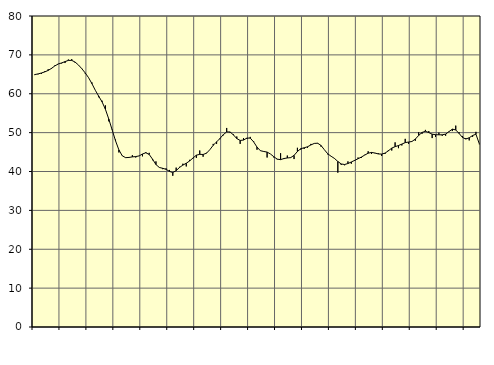
| Category | Piggar | Series 1 |
|---|---|---|
| nan | 64.8 | 64.93 |
| 87.0 | 65 | 65.1 |
| 87.0 | 65.1 | 65.34 |
| 87.0 | 65.8 | 65.62 |
| nan | 66.3 | 66 |
| 88.0 | 66.4 | 66.53 |
| 88.0 | 67.3 | 67.17 |
| 88.0 | 67.7 | 67.65 |
| nan | 67.8 | 67.93 |
| 89.0 | 67.9 | 68.26 |
| 89.0 | 68.8 | 68.58 |
| 89.0 | 68.9 | 68.58 |
| nan | 68 | 68.15 |
| 90.0 | 67.4 | 67.39 |
| 90.0 | 66.5 | 66.44 |
| 90.0 | 65.2 | 65.36 |
| nan | 64.1 | 64.13 |
| 91.0 | 62.9 | 62.59 |
| 91.0 | 60.9 | 60.89 |
| 91.0 | 59.1 | 59.38 |
| nan | 58.2 | 57.92 |
| 92.0 | 57 | 56 |
| 92.0 | 52.9 | 53.49 |
| 92.0 | 50.8 | 50.7 |
| nan | 48.2 | 47.9 |
| 93.0 | 44.9 | 45.55 |
| 93.0 | 44.1 | 44.04 |
| 93.0 | 43.5 | 43.56 |
| nan | 43.6 | 43.62 |
| 94.0 | 44.2 | 43.76 |
| 94.0 | 43.6 | 43.84 |
| 94.0 | 44 | 44.01 |
| nan | 43.9 | 44.5 |
| 95.0 | 45 | 44.82 |
| 95.0 | 44.8 | 44.38 |
| 95.0 | 42.9 | 43.15 |
| nan | 42.6 | 41.79 |
| 96.0 | 41 | 41.04 |
| 96.0 | 40.6 | 40.82 |
| 96.0 | 40.8 | 40.56 |
| nan | 40.4 | 40.03 |
| 97.0 | 38.9 | 39.73 |
| 97.0 | 41 | 40.22 |
| 97.0 | 41.2 | 41.04 |
| nan | 42 | 41.65 |
| 98.0 | 41.3 | 42.12 |
| 98.0 | 43 | 42.71 |
| 98.0 | 43.4 | 43.48 |
| nan | 43.5 | 44.2 |
| 99.0 | 45.4 | 44.41 |
| 99.0 | 43.8 | 44.38 |
| 99.0 | 44.8 | 44.7 |
| nan | 45.6 | 45.61 |
| 0.0 | 47.1 | 46.75 |
| 0.0 | 47.1 | 47.61 |
| 0.0 | 48.3 | 48.49 |
| nan | 49.3 | 49.49 |
| 1.0 | 51.2 | 50.17 |
| 1.0 | 50 | 50.17 |
| 1.0 | 49.6 | 49.42 |
| nan | 49 | 48.47 |
| 2.0 | 47.1 | 47.99 |
| 2.0 | 48.6 | 48.09 |
| 2.0 | 48.4 | 48.6 |
| nan | 48.9 | 48.59 |
| 3.0 | 47.8 | 47.62 |
| 3.0 | 45.6 | 46.28 |
| 3.0 | 45.4 | 45.35 |
| nan | 45.1 | 45.15 |
| 4.0 | 43.6 | 45 |
| 4.0 | 44.5 | 44.5 |
| 4.0 | 43.6 | 43.8 |
| nan | 43.1 | 43.18 |
| 5.0 | 44.7 | 43.05 |
| 5.0 | 43.2 | 43.34 |
| 5.0 | 44.1 | 43.48 |
| nan | 43.5 | 43.57 |
| 6.0 | 43.2 | 44.15 |
| 6.0 | 46.1 | 45.14 |
| 6.0 | 45.6 | 45.87 |
| nan | 45.8 | 46.1 |
| 7.0 | 46.1 | 46.36 |
| 7.0 | 47.1 | 46.83 |
| 7.0 | 47.2 | 47.22 |
| nan | 47.2 | 47.28 |
| 8.0 | 46.4 | 46.7 |
| 8.0 | 45.6 | 45.6 |
| 8.0 | 44.4 | 44.55 |
| nan | 43.9 | 43.92 |
| 9.0 | 43.3 | 43.36 |
| 9.0 | 39.7 | 42.58 |
| 9.0 | 41.7 | 41.94 |
| nan | 41.6 | 41.8 |
| 10.0 | 42.6 | 42.05 |
| 10.0 | 42 | 42.45 |
| 10.0 | 42.7 | 42.86 |
| nan | 43.6 | 43.28 |
| 11.0 | 43.5 | 43.72 |
| 11.0 | 44.3 | 44.23 |
| 11.0 | 45.2 | 44.71 |
| nan | 44.5 | 44.9 |
| 12.0 | 44.7 | 44.76 |
| 12.0 | 44.7 | 44.51 |
| 12.0 | 44 | 44.48 |
| nan | 44.5 | 44.72 |
| 13.0 | 45.5 | 45.32 |
| 13.0 | 45.4 | 46.02 |
| 13.0 | 47.5 | 46.39 |
| nan | 46 | 46.68 |
| 14.0 | 46.7 | 47.05 |
| 14.0 | 48.4 | 47.43 |
| 14.0 | 47.1 | 47.58 |
| nan | 47.7 | 47.72 |
| 15.0 | 47.9 | 48.34 |
| 15.0 | 50.1 | 49.28 |
| 15.0 | 49.7 | 50.05 |
| nan | 50.7 | 50.34 |
| 16.0 | 50.4 | 50.02 |
| 16.0 | 48.6 | 49.6 |
| 16.0 | 48.9 | 49.46 |
| nan | 50 | 49.44 |
| 17.0 | 49.2 | 49.44 |
| 17.0 | 49.2 | 49.62 |
| 17.0 | 50.2 | 50.27 |
| nan | 50.4 | 50.9 |
| 18.0 | 51.8 | 50.69 |
| 18.0 | 50.1 | 49.78 |
| 18.0 | 49.1 | 48.77 |
| nan | 48.6 | 48.35 |
| 19.0 | 48 | 48.68 |
| 19.0 | 48.9 | 49.26 |
| 19.0 | 50.2 | 49.59 |
| nan | 47 | 47.12 |